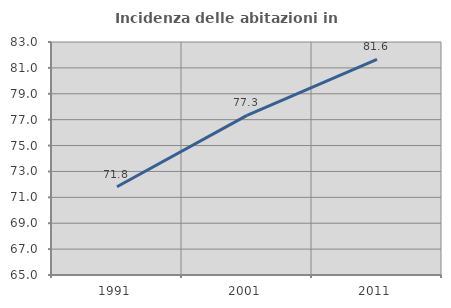
| Category | Incidenza delle abitazioni in proprietà  |
|---|---|
| 1991.0 | 71.816 |
| 2001.0 | 77.332 |
| 2011.0 | 81.649 |